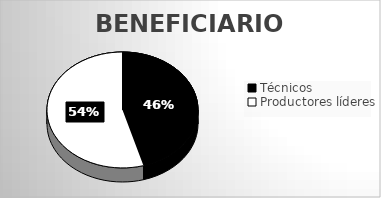
| Category | Series 0 |
|---|---|
| Técnicos | 203 |
| Productores líderes | 243 |